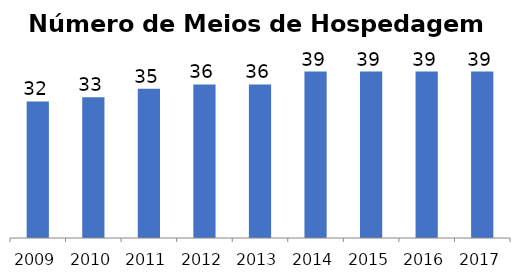
| Category | Meios de Hospedagem |
|---|---|
| 2009.0 | 32 |
| 2010.0 | 33 |
| 2011.0 | 35 |
| 2012.0 | 36 |
| 2013.0 | 36 |
| 2014.0 | 39 |
| 2015.0 | 39 |
| 2016.0 | 39 |
| 2017.0 | 39 |